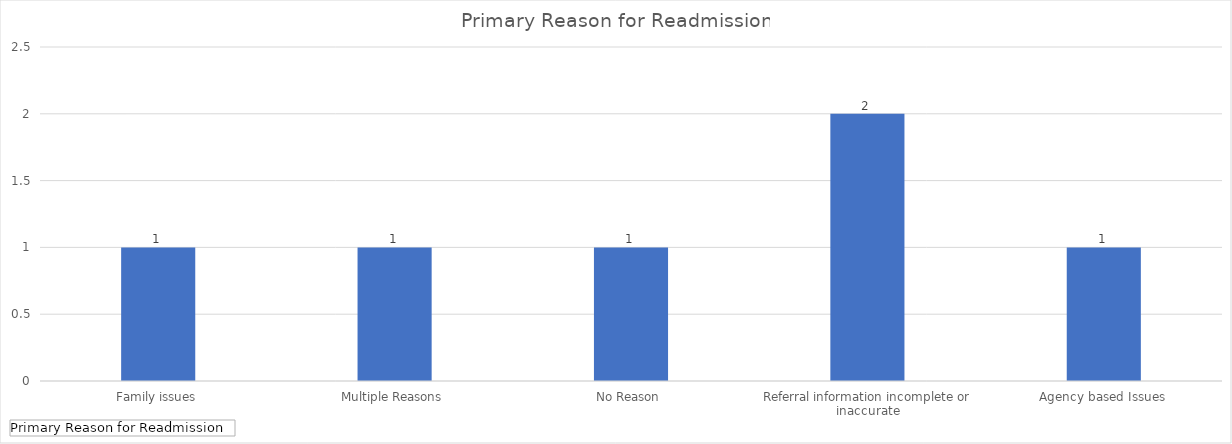
| Category | Total |
|---|---|
| Family issues | 1 |
| Multiple Reasons | 1 |
| No Reason | 1 |
| Referral information incomplete or inaccurate | 2 |
| Agency based Issues | 1 |